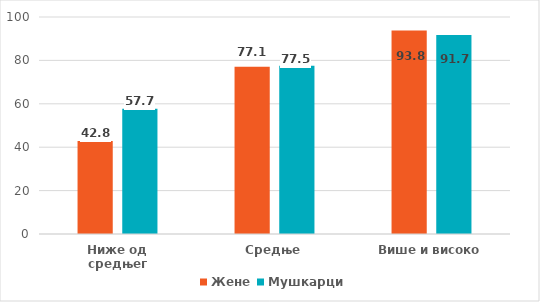
| Category | Жене | Мушкарци |
|---|---|---|
| Ниже од средњег | 42.8 | 57.7 |
| Средње | 77.1 | 77.5 |
| Више и високо | 93.8 | 91.7 |